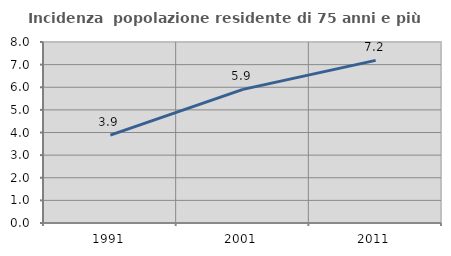
| Category | Incidenza  popolazione residente di 75 anni e più |
|---|---|
| 1991.0 | 3.88 |
| 2001.0 | 5.905 |
| 2011.0 | 7.187 |